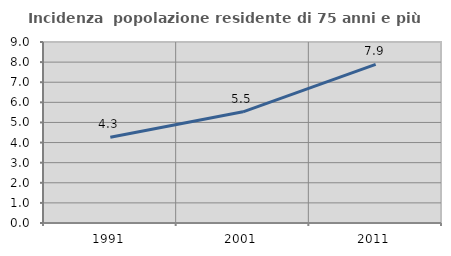
| Category | Incidenza  popolazione residente di 75 anni e più |
|---|---|
| 1991.0 | 4.263 |
| 2001.0 | 5.529 |
| 2011.0 | 7.886 |